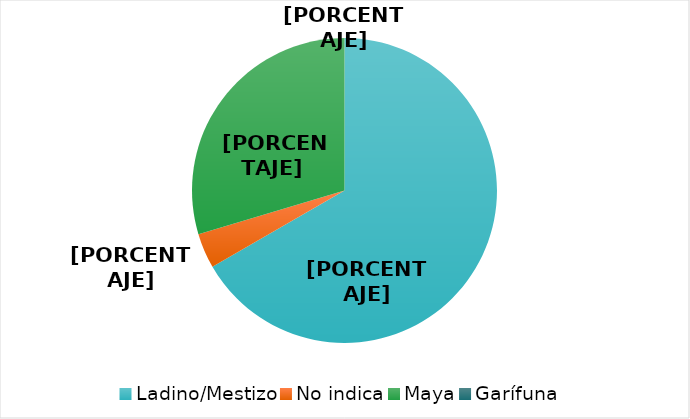
| Category | Series 0 |
|---|---|
| Ladino/Mestizo | 18 |
| No indica | 1 |
| Maya | 8 |
| Garífuna | 0 |